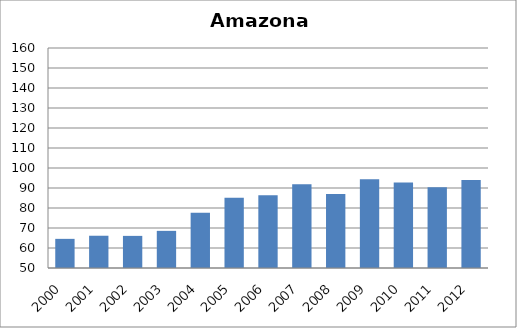
| Category | Hepatite B |
|---|---|
| 2000.0 | 64.57 |
| 2001.0 | 66.13 |
| 2002.0 | 66.06 |
| 2003.0 | 68.57 |
| 2004.0 | 77.6 |
| 2005.0 | 85.09 |
| 2006.0 | 86.34 |
| 2007.0 | 91.82 |
| 2008.0 | 86.98 |
| 2009.0 | 94.33 |
| 2010.0 | 92.73 |
| 2011.0 | 90.33 |
| 2012.0 | 93.98 |